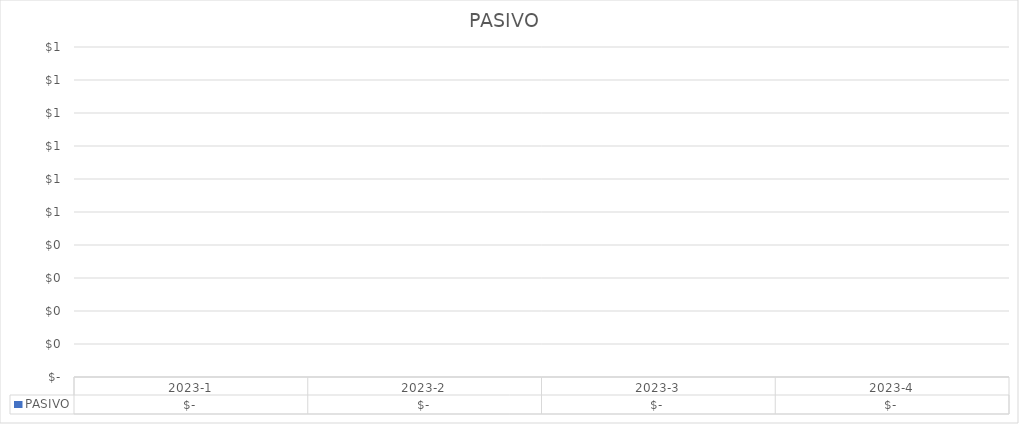
| Category | PASIVO  |
|---|---|
| 2023-1 | 0 |
| 2023-2 | 0 |
| 2023-3 | 0 |
| 2023-4 | 0 |